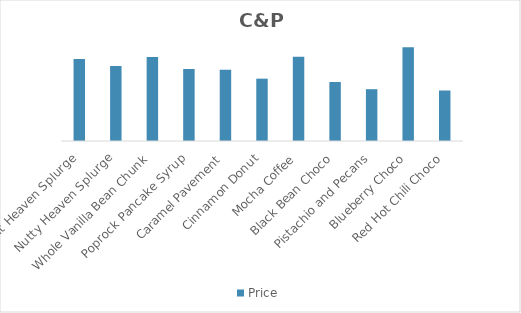
| Category | Price |
|---|---|
| Fruit Heaven Splurge | 5.68 |
| Nutty Heaven Splurge | 5.2 |
| Whole Vanilla Bean Chunk | 5.83 |
| Poprock Pancake Syrup | 4.99 |
| Caramel Pavement | 4.93 |
| Cinnamon Donut | 4.32 |
| Mocha Coffee | 5.84 |
| Black Bean Choco | 4.09 |
| Pistachio and Pecans | 3.59 |
| Blueberry Choco | 6.5 |
| Red Hot Chili Choco | 3.5 |